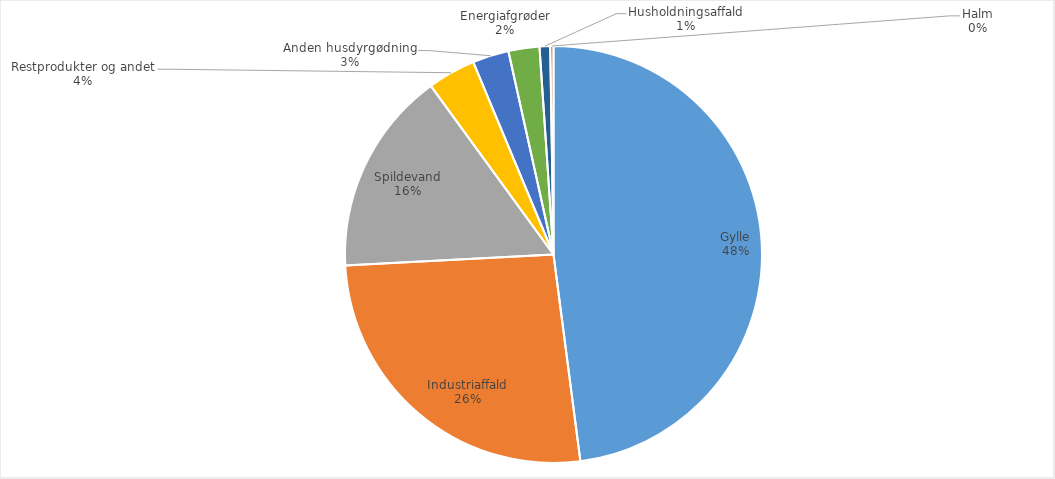
| Category | Series 0 |
|---|---|
| Gylle | 5033745.47 |
| Industriaffald | 2753021.35 |
| Spildevand | 1662228.56 |
| Restprodukter og andet | 391091.04 |
| Anden husdyrgødning | 295190.84 |
| Energiafgrøder | 252188.6 |
| Husholdningsaffald | 86604.13 |
| Halm | 26148 |